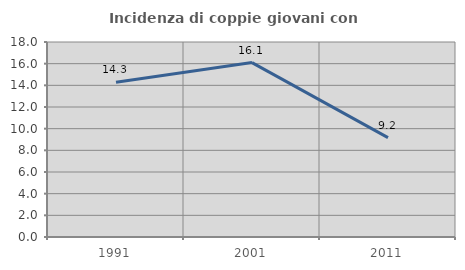
| Category | Incidenza di coppie giovani con figli |
|---|---|
| 1991.0 | 14.286 |
| 2001.0 | 16.102 |
| 2011.0 | 9.174 |